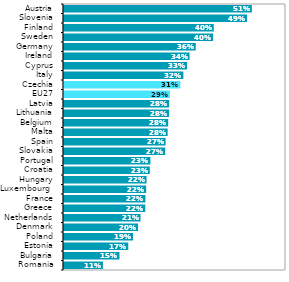
| Category | Series 1 |
|---|---|
| Romania | 0.105 |
| Bulgaria | 0.15 |
| Estonia | 0.174 |
| Poland | 0.186 |
| Denmark | 0.2 |
| Netherlands | 0.207 |
| Greece | 0.22 |
| France | 0.22 |
| Luxembourg  | 0.222 |
| Hungary | 0.223 |
| Croatia | 0.232 |
| Portugal | 0.234 |
| Slovakia | 0.274 |
| Spain | 0.275 |
| Malta | 0.28 |
| Belgium | 0.282 |
| Lithuania | 0.284 |
| Latvia | 0.284 |
| EU27 | 0.286 |
| Czechia | 0.314 |
| Italy | 0.323 |
| Cyprus | 0.333 |
| Ireland | 0.339 |
| Germany | 0.356 |
| Sweden | 0.403 |
| Finland | 0.405 |
| Slovenia | 0.495 |
| Austria | 0.508 |